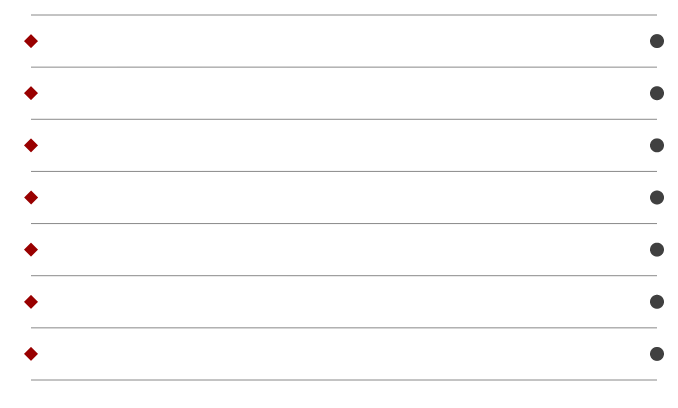
| Category | Series 0 |
|---|---|
| 0.0 | 6.5 |
| 0.0 | 5.5 |
| 0.0 | 4.5 |
| 0.0 | 3.5 |
| 0.0 | 2.5 |
| 0.0 | 1.5 |
| 0.0 | 0.5 |
| 5.0 | 6.5 |
| 5.0 | 5.5 |
| 5.0 | 4.5 |
| 5.0 | 3.5 |
| 5.0 | 2.5 |
| 5.0 | 1.5 |
| 5.0 | 0.5 |